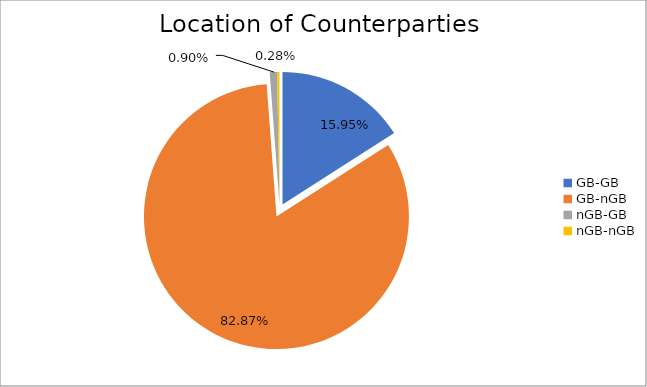
| Category | Series 0 |
|---|---|
| GB-GB | 1521737.274 |
| GB-nGB | 7908414.062 |
| nGB-GB | 86190.961 |
| nGB-nGB | 26821.581 |